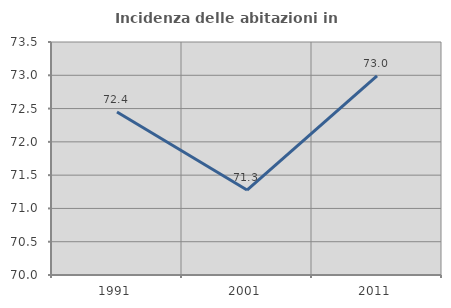
| Category | Incidenza delle abitazioni in proprietà  |
|---|---|
| 1991.0 | 72.449 |
| 2001.0 | 71.277 |
| 2011.0 | 72.993 |